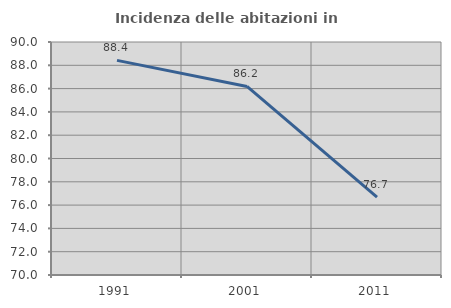
| Category | Incidenza delle abitazioni in proprietà  |
|---|---|
| 1991.0 | 88.421 |
| 2001.0 | 86.182 |
| 2011.0 | 76.678 |